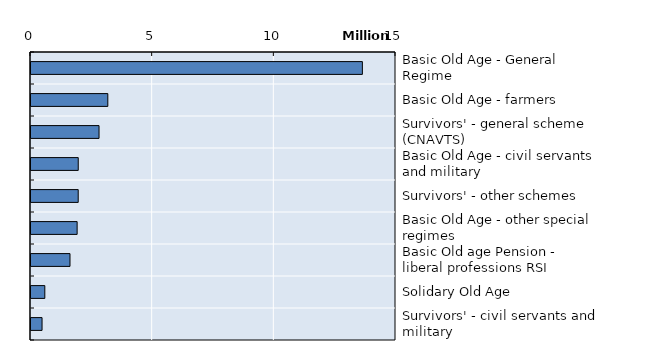
| Category | Series 0 |
|---|---|
| Basic Old Age - General Regime | 13618264 |
| Basic Old Age - farmers | 3157223 |
| Survivors' - general scheme (CNAVTS) | 2796002 |
| Basic Old Age - civil servants and military | 1941623 |
| Survivors' - other schemes | 1940066 |
| Basic Old Age - other special regimes | 1896000 |
| Basic Old age Pension - liberal professions RSI  | 1602252 |
| Solidary Old Age  | 568120 |
| Survivors' - civil servants and military | 454147 |